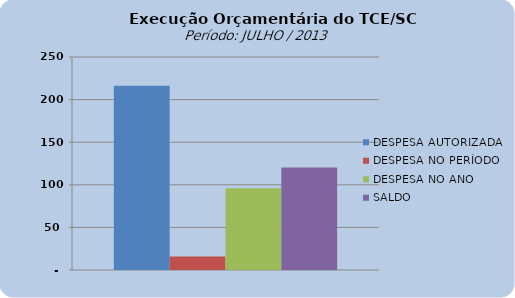
| Category | DESPESA AUTORIZADA | DESPESA NO PERÍODO | DESPESA NO ANO | SALDO |
|---|---|---|---|---|
| 0 | 216234915.81 | 15827230.1 | 95916434.11 | 120318481.7 |